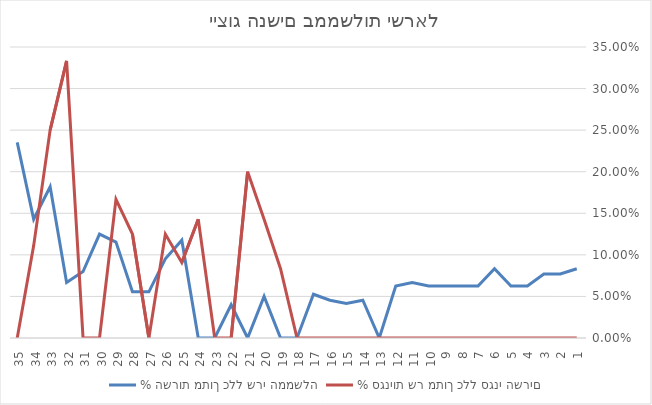
| Category | % השרות מתוך כלל שרי הממשלה | % סגניות שר מתוך כלל סגני השרים |
|---|---|---|
| 1.0 | 0.083 | 0 |
| 2.0 | 0.077 | 0 |
| 3.0 | 0.077 | 0 |
| 4.0 | 0.062 | 0 |
| 5.0 | 0.062 | 0 |
| 6.0 | 0.083 | 0 |
| 7.0 | 0.062 | 0 |
| 8.0 | 0.062 | 0 |
| 9.0 | 0.062 | 0 |
| 10.0 | 0.062 | 0 |
| 11.0 | 0.067 | 0 |
| 12.0 | 0.062 | 0 |
| 13.0 | 0 | 0 |
| 14.0 | 0.045 | 0 |
| 15.0 | 0.042 | 0 |
| 16.0 | 0.045 | 0 |
| 17.0 | 0.053 | 0 |
| 18.0 | 0 | 0 |
| 19.0 | 0 | 0.083 |
| 20.0 | 0.05 | 0.143 |
| 21.0 | 0 | 0.2 |
| 22.0 | 0.04 | 0 |
| 23.0 | 0 | 0 |
| 24.0 | 0 | 0.143 |
| 25.0 | 0.118 | 0.091 |
| 26.0 | 0.095 | 0.125 |
| 27.0 | 0.056 | 0 |
| 28.0 | 0.056 | 0.125 |
| 29.0 | 0.115 | 0.167 |
| 30.0 | 0.125 | 0 |
| 31.0 | 0.08 | 0 |
| 32.0 | 0.067 | 0.333 |
| 33.0 | 0.182 | 0.25 |
| 34.0 | 0.143 | 0.111 |
| 35.0 | 0.235 | 0 |